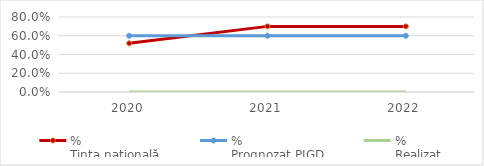
| Category | %
Ținta națională | % 
Prognozat PJGD | % 
Realizat |
|---|---|---|---|
| 2020.0 | 0.52 | 0.6 | 0 |
| 2021.0 | 0.7 | 0.6 | 0 |
| 2022.0 | 0.7 | 0.6 | 0 |